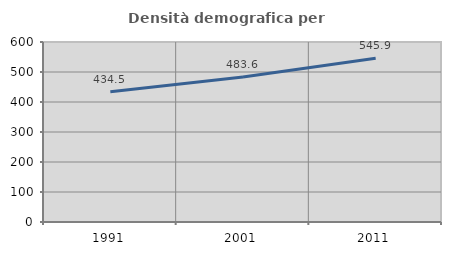
| Category | Densità demografica |
|---|---|
| 1991.0 | 434.49 |
| 2001.0 | 483.639 |
| 2011.0 | 545.914 |